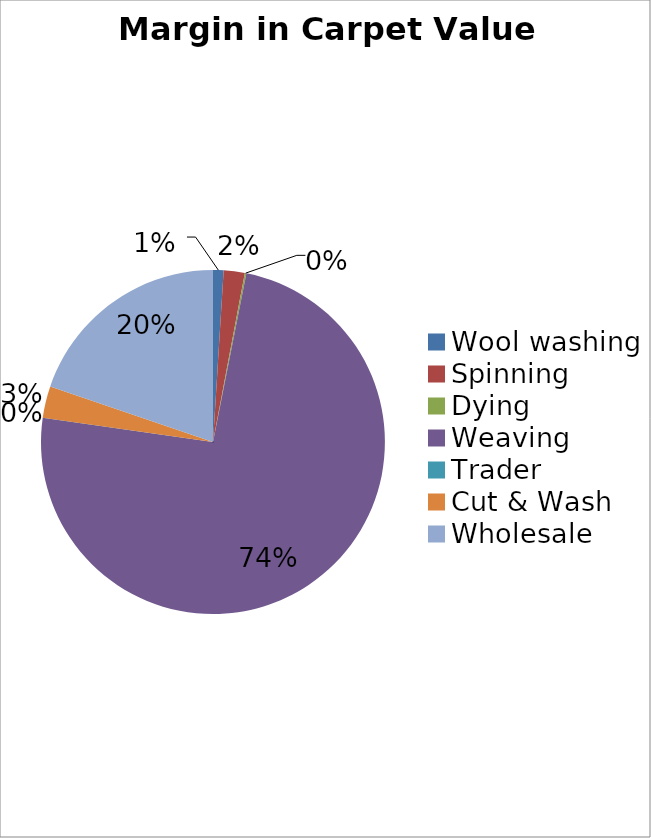
| Category | Margin |
|---|---|
| Wool washing | 2 |
| Spinning | 4 |
| Dying | 0.3 |
| Weaving | 150 |
| Trader | 0 |
| Cut & Wash | 6 |
| Wholesale | 40 |